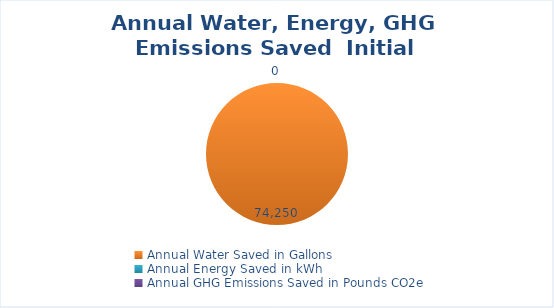
| Category | Series 0 | Series 1 |
|---|---|---|
| Annual Water Saved in Gallons | 74250 | 38030 |
| Annual Energy Saved in kWh | 0 | 3111.29 |
| Annual GHG Emissions Saved in Pounds CO2e | 0 | 1244.15 |